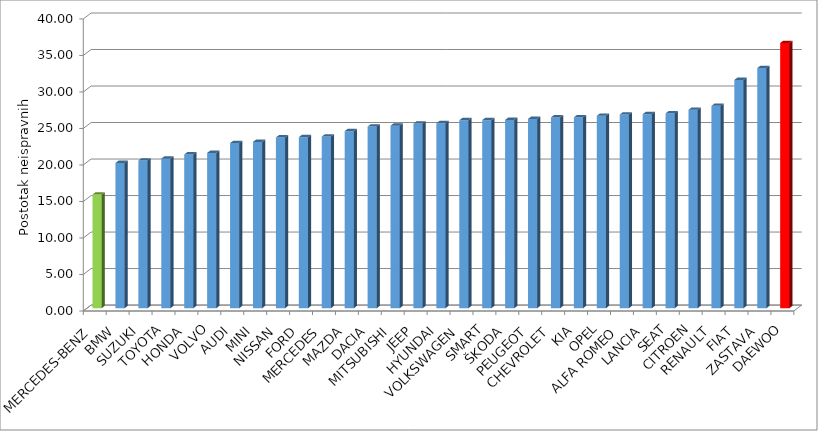
| Category | Series 4 |
|---|---|
| MERCEDES-BENZ | 15.569 |
| BMW | 19.886 |
| SUZUKI | 20.217 |
| TOYOTA | 20.482 |
| HONDA | 21.052 |
| VOLVO | 21.265 |
| AUDI | 22.612 |
| MINI | 22.775 |
| NISSAN | 23.39 |
| FORD | 23.42 |
| MERCEDES | 23.503 |
| MAZDA | 24.245 |
| DACIA | 24.873 |
| MITSUBISHI | 24.991 |
| JEEP | 25.285 |
| HYUNDAI | 25.329 |
| VOLKSWAGEN | 25.74 |
| SMART | 25.754 |
| ŠKODA | 25.781 |
| PEUGEOT | 25.921 |
| CHEVROLET | 26.132 |
| KIA | 26.146 |
| OPEL | 26.35 |
| ALFA ROMEO | 26.523 |
| LANCIA | 26.562 |
| SEAT | 26.681 |
| CITROEN | 27.176 |
| RENAULT | 27.708 |
| FIAT | 31.258 |
| ZASTAVA | 32.88 |
| DAEWOO | 36.317 |